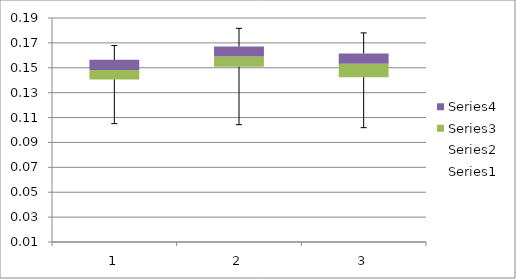
| Category | Series 0 | Series 1 | Series 2 | Series 3 |
|---|---|---|---|---|
| 0 | 0.105 | 0.035 | 0.008 | 0.008 |
| 1 | 0.104 | 0.047 | 0.008 | 0.008 |
| 2 | 0.102 | 0.041 | 0.011 | 0.008 |